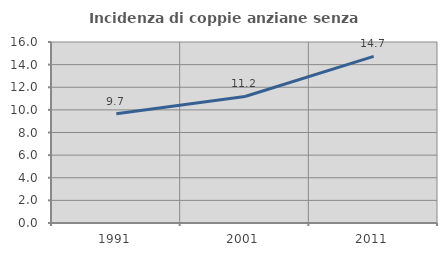
| Category | Incidenza di coppie anziane senza figli  |
|---|---|
| 1991.0 | 9.665 |
| 2001.0 | 11.187 |
| 2011.0 | 14.724 |